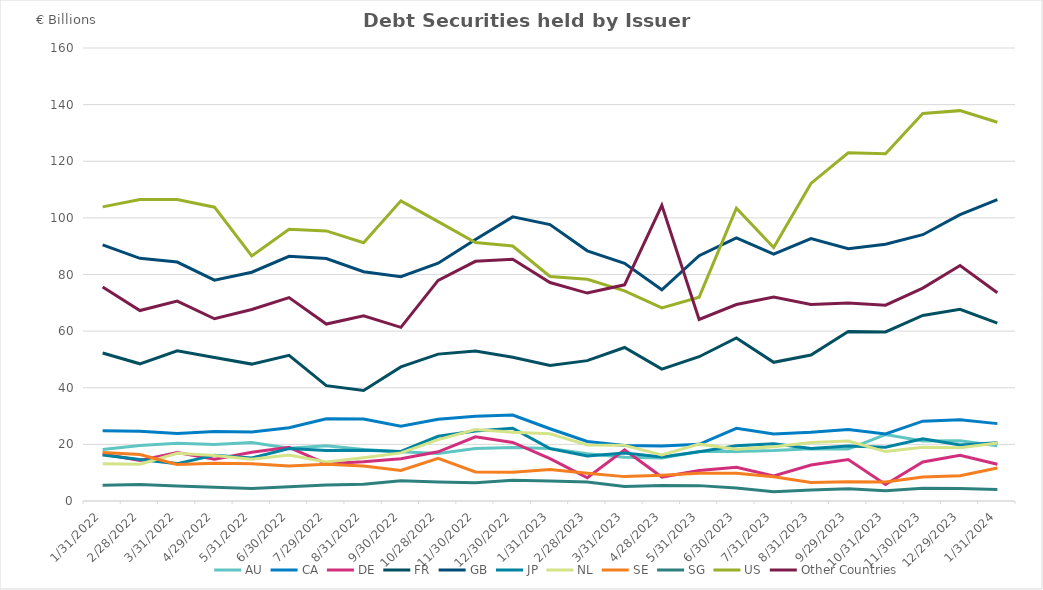
| Category | AU | CA | DE | FR | GB | JP | NL | SE | SG | US | Other Countries |
|---|---|---|---|---|---|---|---|---|---|---|---|
| 1/31/22 | 18.209 | 24.77 | 16.56 | 52.28 | 90.47 | 16.211 | 13.2 | 17.124 | 5.554 | 103.876 | 75.551 |
| 2/28/22 | 19.636 | 24.638 | 14.357 | 48.458 | 85.706 | 14.653 | 13.016 | 16.429 | 5.827 | 106.489 | 67.269 |
| 3/31/22 | 20.436 | 23.839 | 17.113 | 53.081 | 84.395 | 13.205 | 16.839 | 12.868 | 5.311 | 106.45 | 70.583 |
| 4/29/22 | 19.933 | 24.514 | 14.778 | 50.656 | 77.998 | 16.192 | 16.096 | 13.293 | 4.85 | 103.773 | 64.375 |
| 5/31/22 | 20.652 | 24.338 | 17.208 | 48.354 | 80.806 | 15.192 | 14.714 | 13.119 | 4.445 | 86.566 | 67.662 |
| 6/30/22 | 18.61 | 25.868 | 18.938 | 51.448 | 86.443 | 18.526 | 16.257 | 12.352 | 5.066 | 95.959 | 71.852 |
| 7/29/22 | 19.532 | 29.042 | 13.127 | 40.744 | 85.623 | 17.826 | 13.815 | 12.936 | 5.684 | 95.395 | 62.504 |
| 8/31/22 | 18.156 | 28.987 | 13.859 | 39.006 | 80.971 | 17.91 | 15.31 | 12.323 | 5.918 | 91.224 | 65.426 |
| 9/30/22 | 17.425 | 26.424 | 14.923 | 47.346 | 79.199 | 17.516 | 16.99 | 10.763 | 7.112 | 106.025 | 61.343 |
| 10/28/22 | 16.776 | 28.84 | 17.373 | 51.876 | 83.967 | 22.851 | 21.66 | 15.069 | 6.73 | 98.69 | 77.945 |
| 11/30/22 | 18.57 | 29.92 | 22.666 | 52.96 | 92.375 | 24.73 | 25.244 | 10.243 | 6.417 | 91.313 | 84.654 |
| 12/30/22 | 18.926 | 30.336 | 20.699 | 50.76 | 100.348 | 25.693 | 24.296 | 10.143 | 7.356 | 90.057 | 85.362 |
| 1/31/23 | 18.577 | 25.528 | 14.936 | 47.888 | 97.621 | 18.477 | 23.726 | 11.1 | 7.094 | 79.298 | 77.168 |
| 2/28/23 | 16.726 | 21.03 | 8.214 | 49.572 | 88.368 | 15.876 | 19.812 | 9.836 | 6.688 | 78.287 | 73.438 |
| 3/31/23 | 15.452 | 19.622 | 18.07 | 54.211 | 83.96 | 16.953 | 19.647 | 8.611 | 5.095 | 74.195 | 76.351 |
| 4/28/23 | 15.156 | 19.434 | 8.455 | 46.581 | 74.611 | 15.55 | 16.232 | 9.077 | 5.461 | 68.218 | 104.452 |
| 5/31/23 | 17.503 | 20.01 | 10.804 | 50.959 | 86.642 | 17.392 | 20.084 | 9.781 | 5.43 | 71.992 | 64.128 |
| 6/30/23 | 17.474 | 25.687 | 11.898 | 57.568 | 92.919 | 19.503 | 18.31 | 9.787 | 4.565 | 103.409 | 69.389 |
| 7/31/23 | 17.8 | 23.67 | 8.832 | 48.985 | 87.205 | 20.201 | 19.17 | 8.55 | 3.304 | 89.518 | 72.058 |
| 8/31/23 | 18.444 | 24.266 | 12.717 | 51.576 | 92.664 | 18.586 | 20.667 | 6.571 | 3.889 | 112.176 | 69.425 |
| 9/29/23 | 18.338 | 25.283 | 14.639 | 59.903 | 89.072 | 19.388 | 21.162 | 6.809 | 4.286 | 122.971 | 69.898 |
| 10/31/23 | 23.447 | 23.657 | 5.827 | 59.694 | 90.684 | 18.974 | 17.448 | 6.698 | 3.628 | 122.683 | 69.155 |
| 11/30/23 | 21.221 | 28.184 | 13.791 | 65.522 | 94.056 | 21.991 | 18.998 | 8.446 | 4.533 | 136.849 | 75.198 |
| 12/29/23 | 21.247 | 28.662 | 16.13 | 67.732 | 101.157 | 19.781 | 18.848 | 8.924 | 4.453 | 137.875 | 83.161 |
| 1/31/24 | 19.511 | 27.331 | 12.981 | 62.796 | 106.421 | 20.588 | 20.47 | 11.67 | 4.061 | 133.791 | 73.525 |